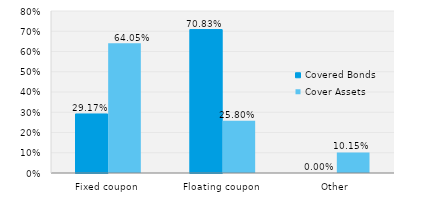
| Category | Covered Bonds | Cover Assets |
|---|---|---|
| Fixed coupon | 0.292 | 0.64 |
| Floating coupon | 0.708 | 0.258 |
| Other | 0 | 0.102 |